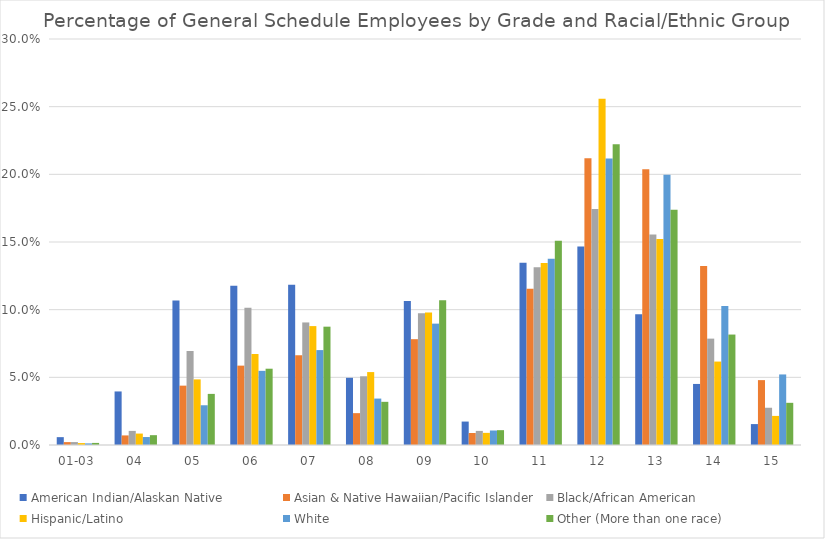
| Category | American Indian/Alaskan Native | Asian & Native Hawaiian/Pacific Islander | Black/African American | Hispanic/Latino | White | Other (More than one race) |
|---|---|---|---|---|---|---|
| 01-03 | 0.006 | 0.002 | 0.002 | 0.001 | 0.001 | 0.002 |
| 04 | 0.04 | 0.007 | 0.01 | 0.008 | 0.006 | 0.007 |
| 05 | 0.107 | 0.044 | 0.069 | 0.048 | 0.029 | 0.038 |
| 06 | 0.118 | 0.059 | 0.101 | 0.067 | 0.055 | 0.056 |
| 07 | 0.118 | 0.066 | 0.091 | 0.088 | 0.07 | 0.087 |
| 08 | 0.05 | 0.024 | 0.051 | 0.054 | 0.034 | 0.032 |
| 09 | 0.106 | 0.078 | 0.097 | 0.098 | 0.09 | 0.107 |
| 10 | 0.017 | 0.009 | 0.01 | 0.009 | 0.011 | 0.011 |
| 11 | 0.135 | 0.116 | 0.131 | 0.134 | 0.138 | 0.151 |
| 12 | 0.147 | 0.212 | 0.174 | 0.256 | 0.212 | 0.222 |
| 13 | 0.097 | 0.204 | 0.156 | 0.152 | 0.2 | 0.174 |
| 14 | 0.045 | 0.132 | 0.079 | 0.062 | 0.103 | 0.082 |
| 15 | 0.015 | 0.048 | 0.028 | 0.021 | 0.052 | 0.031 |